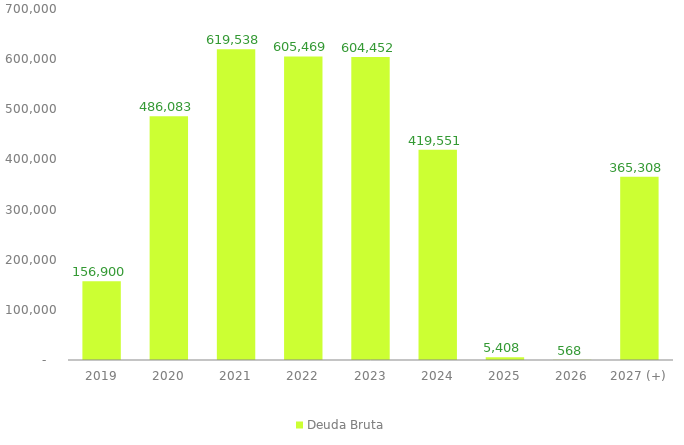
| Category | Deuda Bruta |
|---|---|
| 2019 | 156899.945 |
| 2020 | 486082.514 |
| 2021 | 619537.651 |
| 2022 | 605468.881 |
| 2023 | 604451.608 |
| 2024 | 419550.566 |
| 2025 | 5407.91 |
| 2026 | 567.533 |
| 2027 (+) | 365308.238 |